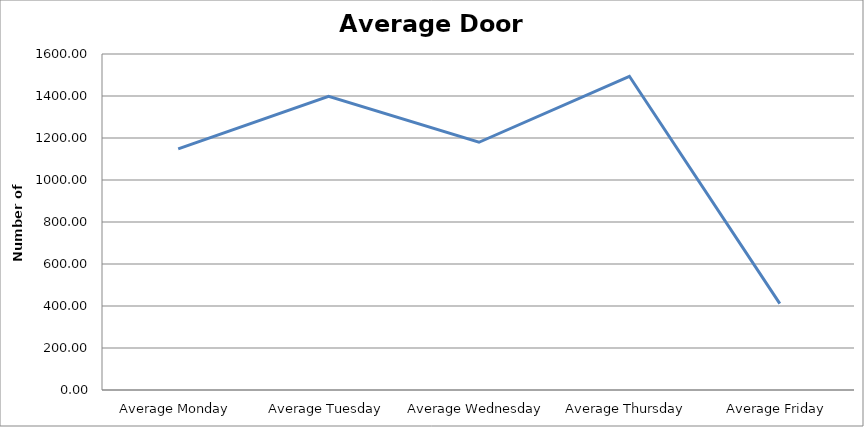
| Category | Series 0 |
|---|---|
| Average Monday | 1148 |
| Average Tuesday | 1398.75 |
| Average Wednesday | 1179.75 |
| Average Thursday | 1494 |
| Average Friday | 411.25 |